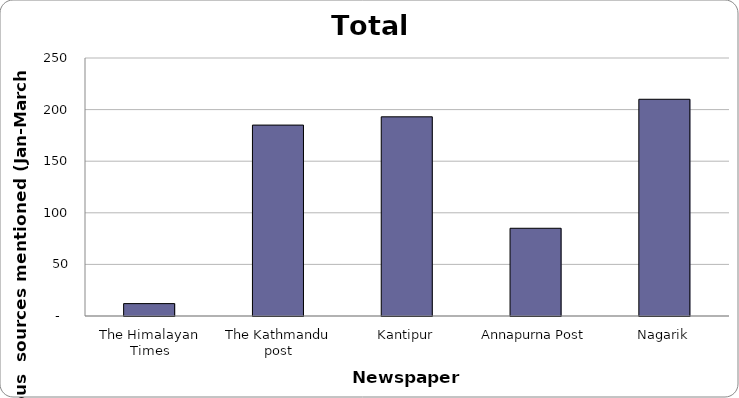
| Category | Series 0 |
|---|---|
| The Himalayan Times | 12 |
| The Kathmandu post | 185 |
| Kantipur | 193 |
| Annapurna Post | 85 |
| Nagarik | 210 |